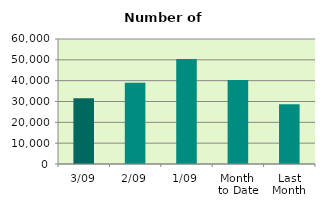
| Category | Series 0 |
|---|---|
| 3/09 | 31568 |
| 2/09 | 38970 |
| 1/09 | 50354 |
| Month 
to Date | 40297.333 |
| Last
Month | 28637.636 |